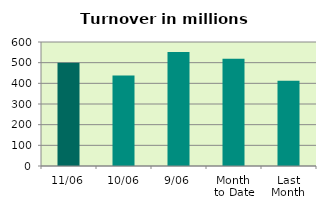
| Category | Series 0 |
|---|---|
| 11/06 | 499.221 |
| 10/06 | 437.677 |
| 9/06 | 551.291 |
| Month 
to Date | 519.513 |
| Last
Month | 412.236 |